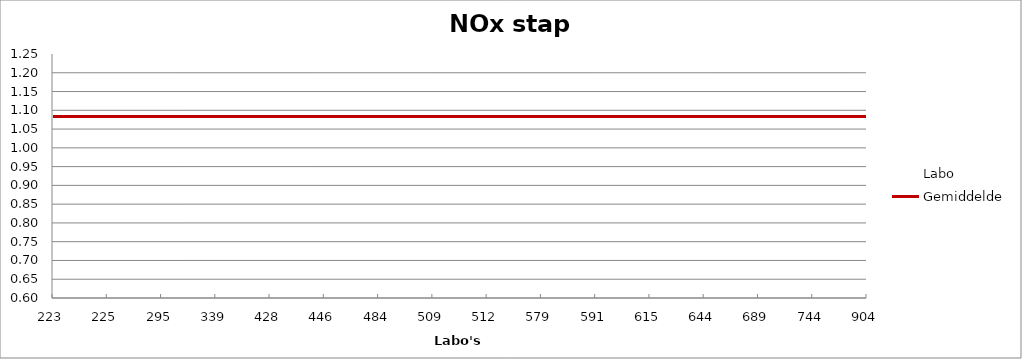
| Category | Labo | Gemiddelde |
|---|---|---|
| 223.0 | 1.233 | 1.084 |
| 225.0 | 1.045 | 1.084 |
| 295.0 | 1.191 | 1.084 |
| 339.0 | 0.64 | 1.084 |
| 428.0 | 1.137 | 1.084 |
| 446.0 | 1.024 | 1.084 |
| 484.0 | 1.037 | 1.084 |
| 509.0 | 1.012 | 1.084 |
| 512.0 | 1.07 | 1.084 |
| 579.0 | 0.966 | 1.084 |
| 591.0 | 1.112 | 1.084 |
| 615.0 | 0.903 | 1.084 |
| 644.0 | 1.171 | 1.084 |
| 689.0 | 0.962 | 1.084 |
| 744.0 | 1.171 | 1.084 |
| 904.0 | 0.895 | 1.084 |